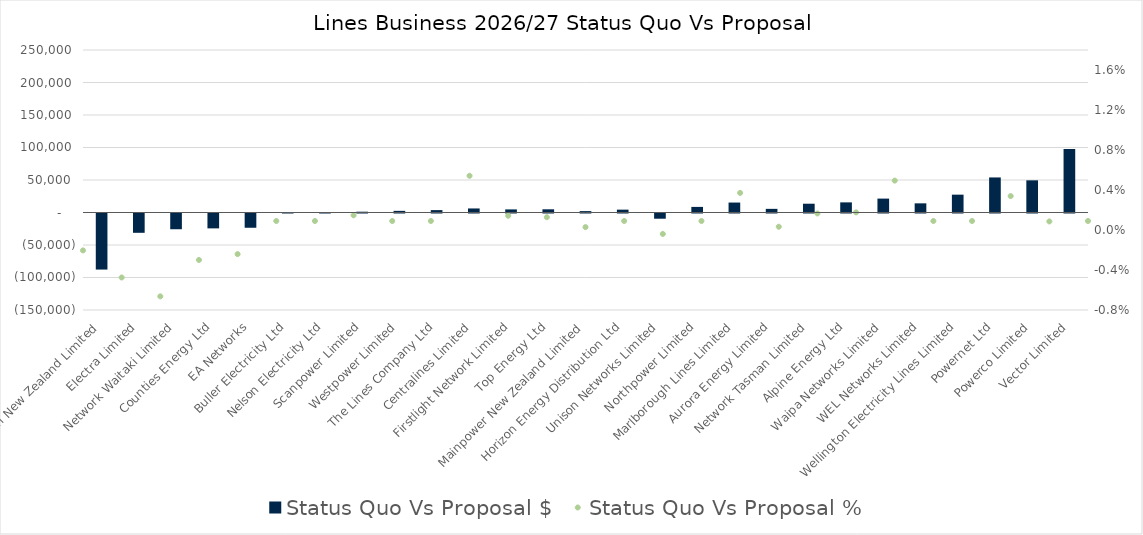
| Category | Status Quo Vs Proposal $ |
|---|---|
| Orion New Zealand Limited | -86254.076 |
| Electra Limited | -29710.397 |
| Network Waitaki Limited | -24218.13 |
| Counties Energy Ltd | -22885.794 |
| EA Networks | -21933.871 |
| Buller Electricity Ltd | 514.813 |
| Nelson Electricity Ltd | 669.546 |
| Scanpower Limited | 1223.495 |
| Westpower Limited | 2530.046 |
| The Lines Company Ltd | 3682.591 |
| Centralines Limited | 6223.026 |
| Firstlight Network Limited | 4762.167 |
| Top Energy Ltd | 4921.13 |
| Mainpower New Zealand Limited | 2153.808 |
| Horizon Energy Distribution Ltd | 4393.042 |
| Unison Networks Limited | -8022.449 |
| Northpower Limited | 8603.686 |
| Marlborough Lines Limited | 15304.51 |
| Aurora Energy Limited | 5609.301 |
| Network Tasman Limited | 13517.382 |
| Alpine Energy Ltd | 15576.075 |
| Waipa Networks Limited | 21390.252 |
| WEL Networks Limited | 14093.074 |
| Wellington Electricity Lines Limited | 27444.962 |
| Powernet Ltd | 53933.116 |
| Powerco Limited | 49493.119 |
| Vector Limited | 97558.054 |